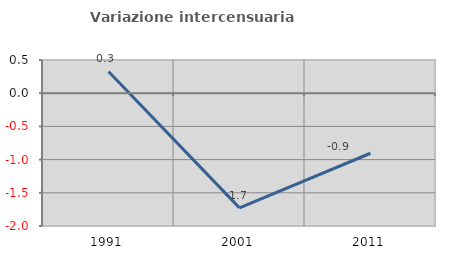
| Category | Variazione intercensuaria annua |
|---|---|
| 1991.0 | 0.328 |
| 2001.0 | -1.727 |
| 2011.0 | -0.904 |